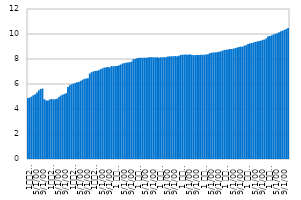
| Category | Девизна штедња становништва |
|---|---|
| 1
2008. | 4.879 |
| 2 | 4.915 |
| 3 | 4.991 |
| 4 | 5.099 |
| 5 | 5.174 |
| 6 | 5.316 |
| 7 | 5.493 |
| 8 | 5.602 |
| 9 | 5.643 |
| 10 | 4.788 |
| 11 | 4.687 |
| 12 | 4.679 |
| 1
2009. | 4.753 |
| 2 | 4.812 |
| 3 | 4.77 |
| 4 | 4.783 |
| 5 | 4.822 |
| 6 | 4.949 |
| 7 | 5.068 |
| 8 | 5.136 |
| 9 | 5.202 |
| 10 | 5.257 |
| 11 | 5.755 |
| 12 | 5.905 |
| 1
2010. | 5.977 |
| 2 | 6.029 |
| 3 | 6.072 |
| 4 | 6.135 |
| 5 | 6.163 |
| 6 | 6.249 |
| 7 | 6.334 |
| 8 | 6.407 |
| 9 | 6.432 |
| 10 | 6.452 |
| 11 | 6.843 |
| 12 | 6.939 |
| 1
2011. | 7.004 |
| 2 | 7.045 |
| 3 | 7.055 |
| 4 | 7.099 |
| 5 | 7.189 |
| 6 | 7.247 |
| 7 | 7.304 |
| 8 | 7.331 |
| 9 | 7.355 |
| 10 | 7.334 |
| 11 | 7.435 |
| 12 | 7.412 |
| 1 
2012. | 7.43 |
| 2 | 7.449 |
| 3 | 7.491 |
| 4 | 7.555 |
| 5 | 7.638 |
| 6 | 7.67 |
| 7 | 7.704 |
| 8 | 7.713 |
| 9 | 7.744 |
| 10 | 7.801 |
| 11 | 7.984 |
| 12 | 8.001 |
| 1 
2013. | 8.056 |
| 2 | 8.09 |
| 3 | 8.104 |
| 4 | 8.089 |
| 5 | 8.109 |
| 6 | 8.099 |
| 7 | 8.113 |
| 8 | 8.145 |
| 9 | 8.143 |
| 10 | 8.139 |
| 11 | 8.125 |
| 12 | 8.146 |
| 1 
2014. | 8.105 |
| 2 | 8.136 |
| 3 | 8.128 |
| 4 | 8.153 |
| 5 | 8.145 |
| 6 | 8.2 |
| 7 | 8.209 |
| 8 | 8.218 |
| 9 | 8.219 |
| 10 | 8.24 |
| 11 | 8.212 |
| 12 | 8.253 |
| 1 
2015. | 8.329 |
| 2 | 8.334 |
| 3 | 8.36 |
| 4 | 8.349 |
| 5 | 8.345 |
| 6 | 8.376 |
| 7 | 8.335 |
| 8 | 8.321 |
| 9 | 8.31 |
| 10 | 8.326 |
| 11 | 8.314 |
| 12 | 8.339 |
| 1 
2016. | 8.335 |
| 2 | 8.347 |
| 3 | 8.358 |
| 4 | 8.384 |
| 5 | 8.466 |
| 6 | 8.5 |
| 7 | 8.525 |
| 8 | 8.535 |
| 9 | 8.547 |
| 10 | 8.587 |
| 11 | 8.613 |
| 12 | 8.674 |
| 1 
2017. | 8.718 |
| 2 | 8.742 |
| 3 | 8.769 |
| 4 | 8.802 |
| 5 | 8.798 |
| 6 | 8.83 |
| 7 | 8.873 |
| 8 | 8.911 |
| 9 | 8.956 |
| 10 | 8.985 |
| 11 | 8.994 |
| 12 | 9.069 |
| 1 
2018. | 9.105 |
| 2 | 9.203 |
| 3 | 9.25 |
| 4 | 9.276 |
| 5 | 9.319 |
| 6 | 9.37 |
| 7 | 9.397 |
| 8 | 9.445 |
| 9 | 9.465 |
| 10 | 9.528 |
| 11 | 9.561 |
| 12 | 9.643 |
| 1 
2019. | 9.793 |
| 2 | 9.843 |
| 3 | 9.894 |
| 4 | 9.965 |
| 5 | 10.015 |
| 6 | 10.059 |
| 7 | 10.136 |
| 8 | 10.215 |
| 9 | 10.27 |
| 10 | 10.329 |
| 11 | 10.396 |
| 12 | 10.473 |